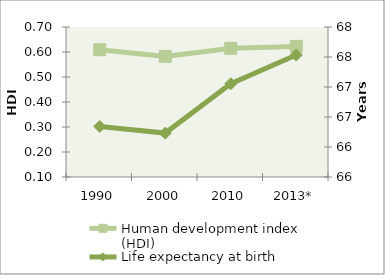
| Category | Human development index (HDI) |
|---|---|
| 1990 | 0.609 |
| 2000 | 0.582 |
| 2010 | 0.615 |
| 2013* | 0.622 |